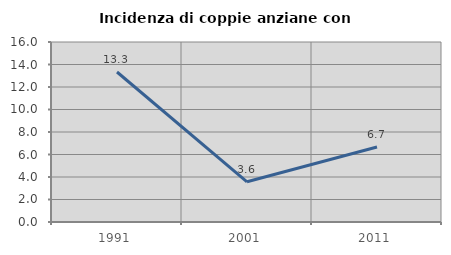
| Category | Incidenza di coppie anziane con figli |
|---|---|
| 1991.0 | 13.333 |
| 2001.0 | 3.571 |
| 2011.0 | 6.667 |